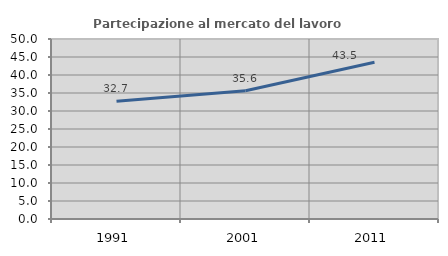
| Category | Partecipazione al mercato del lavoro  femminile |
|---|---|
| 1991.0 | 32.701 |
| 2001.0 | 35.642 |
| 2011.0 | 43.546 |